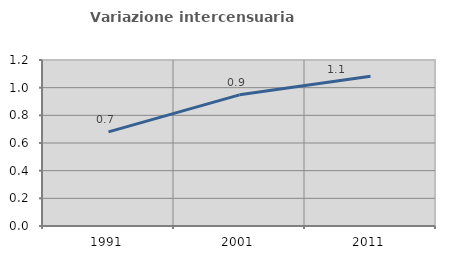
| Category | Variazione intercensuaria annua |
|---|---|
| 1991.0 | 0.681 |
| 2001.0 | 0.948 |
| 2011.0 | 1.082 |